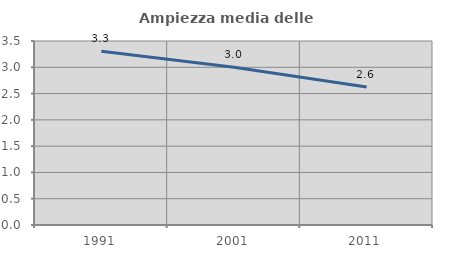
| Category | Ampiezza media delle famiglie |
|---|---|
| 1991.0 | 3.303 |
| 2001.0 | 2.999 |
| 2011.0 | 2.627 |